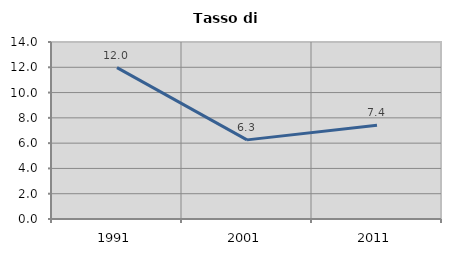
| Category | Tasso di disoccupazione   |
|---|---|
| 1991.0 | 11.975 |
| 2001.0 | 6.258 |
| 2011.0 | 7.407 |